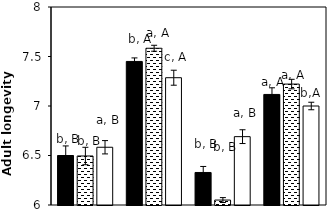
| Category | AB | AC | CK |
|---|---|---|---|
| aCO2-Bt | 6.5 | 6.495 | 6.583 |
| aCO2-Xy | 7.45 | 7.583 | 7.286 |
| eCO2-Bt | 6.329 | 6.05 | 6.69 |
| eCO2-Xy | 7.117 | 7.221 | 7 |